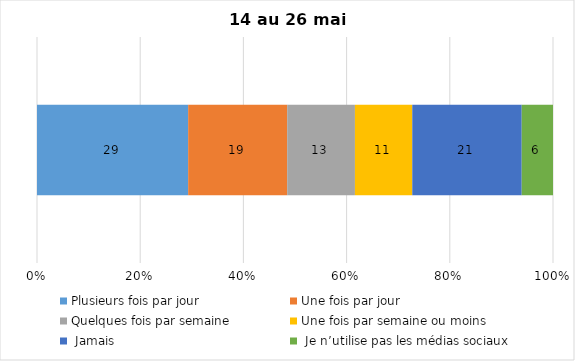
| Category | Plusieurs fois par jour | Une fois par jour | Quelques fois par semaine   | Une fois par semaine ou moins   |  Jamais   |  Je n’utilise pas les médias sociaux |
|---|---|---|---|---|---|---|
| 0 | 29 | 19 | 13 | 11 | 21 | 6 |